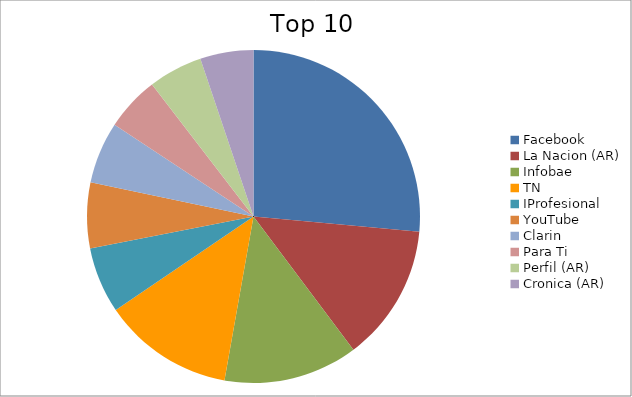
| Category | Series 0 |
|---|---|
| Facebook | 14.63 |
| La Nacion (AR) | 7.36 |
| Infobae | 7.21 |
| TN | 7.03 |
| IProfesional | 3.55 |
| YouTube | 3.52 |
| Clarin | 3.32 |
| Para Ti | 2.92 |
| Perfil (AR) | 2.91 |
| Cronica (AR) | 2.86 |